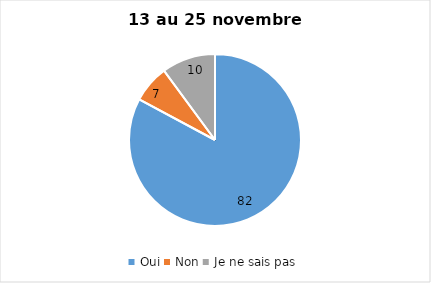
| Category | Series 0 |
|---|---|
| Oui | 82 |
| Non | 7 |
| Je ne sais pas | 10 |